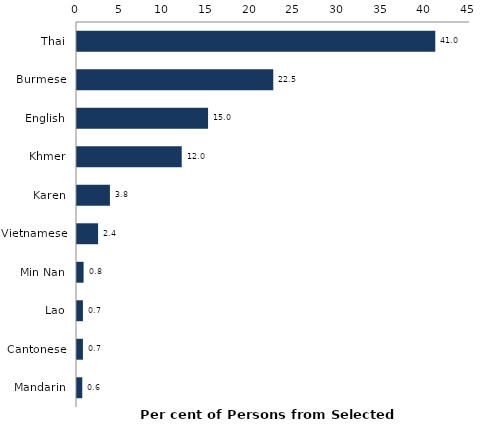
| Category | Series 0 |
|---|---|
| Thai | 41.026 |
| Burmese | 22.474 |
| English | 15.008 |
| Khmer | 11.991 |
| Karen | 3.771 |
| Vietnamese | 2.413 |
| Min Nan | 0.754 |
| Lao | 0.679 |
| Cantonese | 0.679 |
| Mandarin | 0.603 |